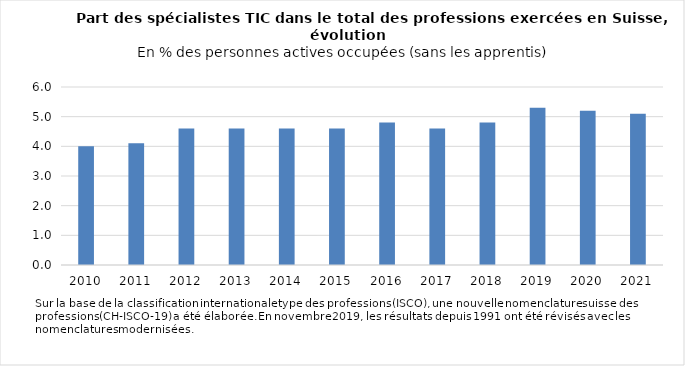
| Category | %  |
|---|---|
| 2010.0 | 4 |
| 2011.0 | 4.1 |
| 2012.0 | 4.6 |
| 2013.0 | 4.6 |
| 2014.0 | 4.6 |
| 2015.0 | 4.6 |
| 2016.0 | 4.8 |
| 2017.0 | 4.6 |
| 2018.0 | 4.8 |
| 2019.0 | 5.3 |
| 2020.0 | 5.2 |
| 2021.0 | 5.1 |